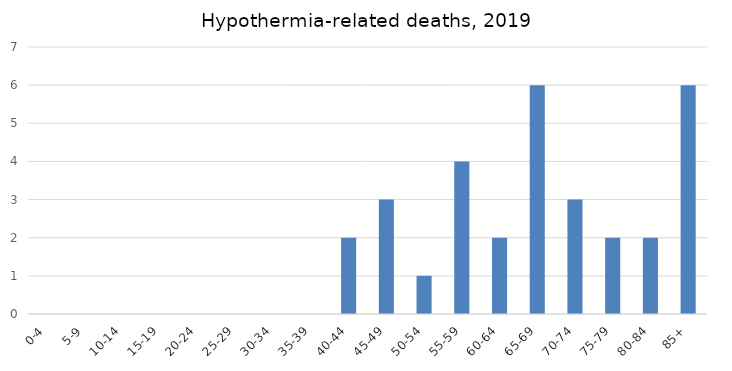
| Category | Series 0 |
|---|---|
| 0-4 | 0 |
| 5-9 | 0 |
| 10-14 | 0 |
| 15-19 | 0 |
| 20-24 | 0 |
| 25-29 | 0 |
| 30-34 | 0 |
| 35-39 | 0 |
| 40-44 | 2 |
| 45-49 | 3 |
| 50-54 | 1 |
| 55-59 | 4 |
| 60-64 | 2 |
| 65-69 | 6 |
| 70-74 | 3 |
| 75-79 | 2 |
| 80-84 | 2 |
| 85+ | 6 |